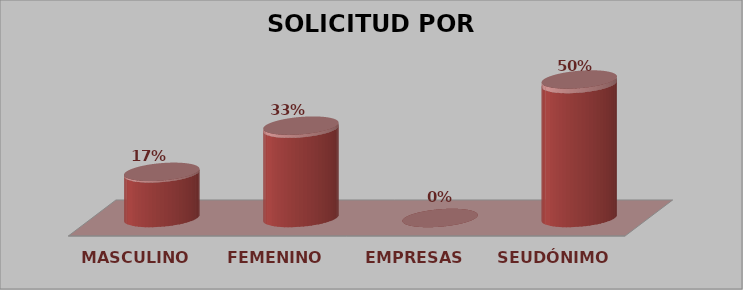
| Category | SOLICITUD POR GÉNERO | Series 1 |
|---|---|---|
| MASCULINO | 5 | 0.167 |
| FEMENINO | 10 | 0.333 |
| EMPRESAS | 0 | 0 |
| SEUDÓNIMO | 15 | 0.5 |